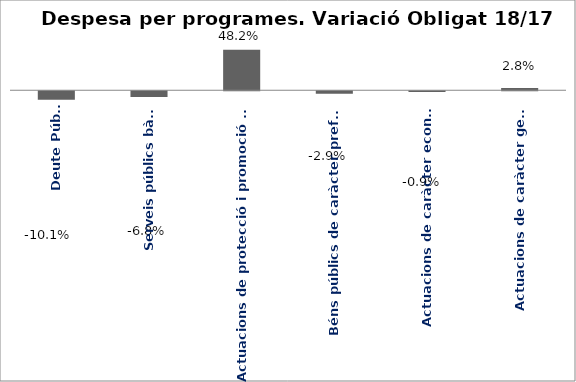
| Category | Series 0 |
|---|---|
| Deute Públic | -0.101 |
| Serveis públics bàsics | -0.068 |
| Actuacions de protecció i promoció social | 0.482 |
| Béns públics de caràcter preferent | -0.029 |
| Actuacions de caràcter econòmic | -0.009 |
| Actuacions de caràcter general | 0.028 |